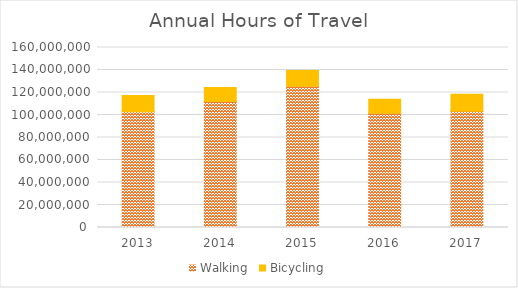
| Category | Walking | Bicycling |
|---|---|---|
| 2013 | 102794680.517 | 14478749.517 |
| 2014 | 112095866.162 | 12260429.839 |
| 2015 | 125525037.79 | 14007968.195 |
| 2016 | 101536619.837 | 12520317.045 |
| 2017 | 103395731.915 | 15134286.444 |